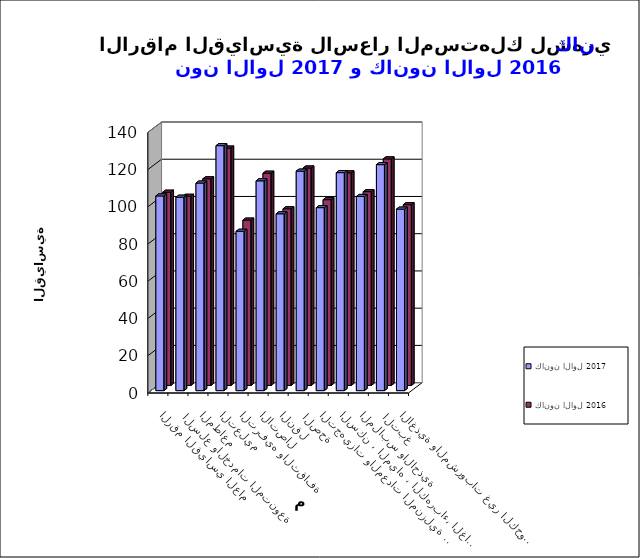
| Category | كانون الاول 2017      | كانون الاول 2016 |
|---|---|---|
| الاغذية والمشروبات غير الكحولية | 97.5 | 97.1 |
|  التبغ | 121.4 | 121.7 |
| الملابس والاحذية | 104.3 | 104.1 |
| السكن ، المياه ، الكهرباء، الغاز  | 117.1 | 114.2 |
| التجهيزات والمعدات المنزلية والصيانة | 98.3 | 99.8 |
|  الصحة | 117.9 | 116.8 |
| النقل | 95 | 94.9 |
| الاتصال | 112.7 | 114 |
| الترفيه والثقافة | 85.6 | 88.8 |
| التعليم | 131.6 | 127.5 |
| المطاعم  | 111.5 | 111 |
|  السلع والخدمات المتنوعة | 103.9 | 101.6 |
| الرقم القياسي العام | 104.6 | 103.8 |